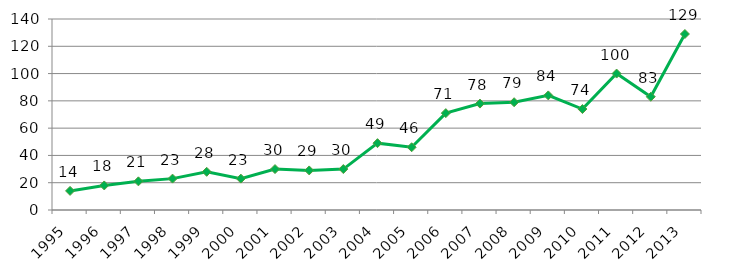
| Category | QTD OBRAS |
|---|---|
| 1995.0 | 14 |
| 1996.0 | 18 |
| 1997.0 | 21 |
| 1998.0 | 23 |
| 1999.0 | 28 |
| 2000.0 | 23 |
| 2001.0 | 30 |
| 2002.0 | 29 |
| 2003.0 | 30 |
| 2004.0 | 49 |
| 2005.0 | 46 |
| 2006.0 | 71 |
| 2007.0 | 78 |
| 2008.0 | 79 |
| 2009.0 | 84 |
| 2010.0 | 74 |
| 2011.0 | 100 |
| 2012.0 | 83 |
| 2013.0 | 129 |